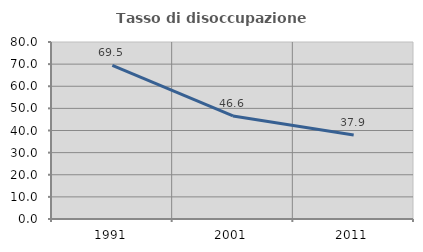
| Category | Tasso di disoccupazione giovanile  |
|---|---|
| 1991.0 | 69.466 |
| 2001.0 | 46.575 |
| 2011.0 | 37.931 |